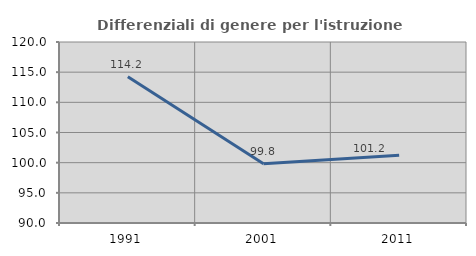
| Category | Differenziali di genere per l'istruzione superiore |
|---|---|
| 1991.0 | 114.241 |
| 2001.0 | 99.814 |
| 2011.0 | 101.215 |